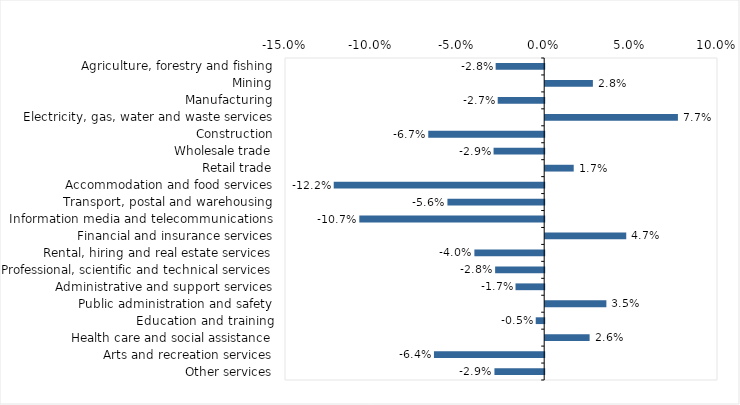
| Category | This week |
|---|---|
| Agriculture, forestry and fishing | -0.028 |
| Mining | 0.028 |
| Manufacturing | -0.027 |
| Electricity, gas, water and waste services | 0.077 |
| Construction | -0.067 |
| Wholesale trade | -0.029 |
| Retail trade | 0.016 |
| Accommodation and food services | -0.122 |
| Transport, postal and warehousing | -0.056 |
| Information media and telecommunications | -0.107 |
| Financial and insurance services | 0.047 |
| Rental, hiring and real estate services | -0.04 |
| Professional, scientific and technical services | -0.028 |
| Administrative and support services | -0.017 |
| Public administration and safety | 0.035 |
| Education and training | -0.005 |
| Health care and social assistance | 0.026 |
| Arts and recreation services | -0.064 |
| Other services | -0.029 |